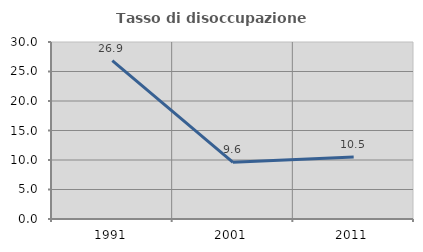
| Category | Tasso di disoccupazione giovanile  |
|---|---|
| 1991.0 | 26.857 |
| 2001.0 | 9.6 |
| 2011.0 | 10.526 |